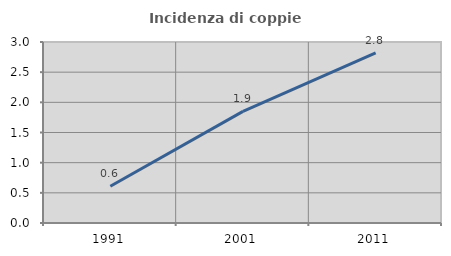
| Category | Incidenza di coppie miste |
|---|---|
| 1991.0 | 0.61 |
| 2001.0 | 1.85 |
| 2011.0 | 2.82 |